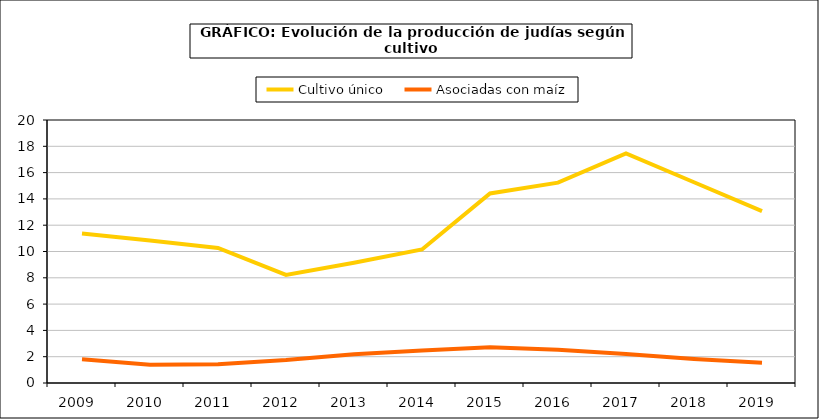
| Category | Cultivo único | Asociadas con maíz |
|---|---|---|
| 2009.0 | 11.367 | 1.808 |
| 2010.0 | 10.837 | 1.389 |
| 2011.0 | 10.269 | 1.432 |
| 2012.0 | 8.22 | 1.751 |
| 2013.0 | 9.15 | 2.187 |
| 2014.0 | 10.155 | 2.474 |
| 2015.0 | 14.413 | 2.712 |
| 2016.0 | 15.236 | 2.525 |
| 2017.0 | 17.463 | 2.212 |
| 2018.0 | 15.268 | 1.823 |
| 2019.0 | 13.075 | 1.54 |